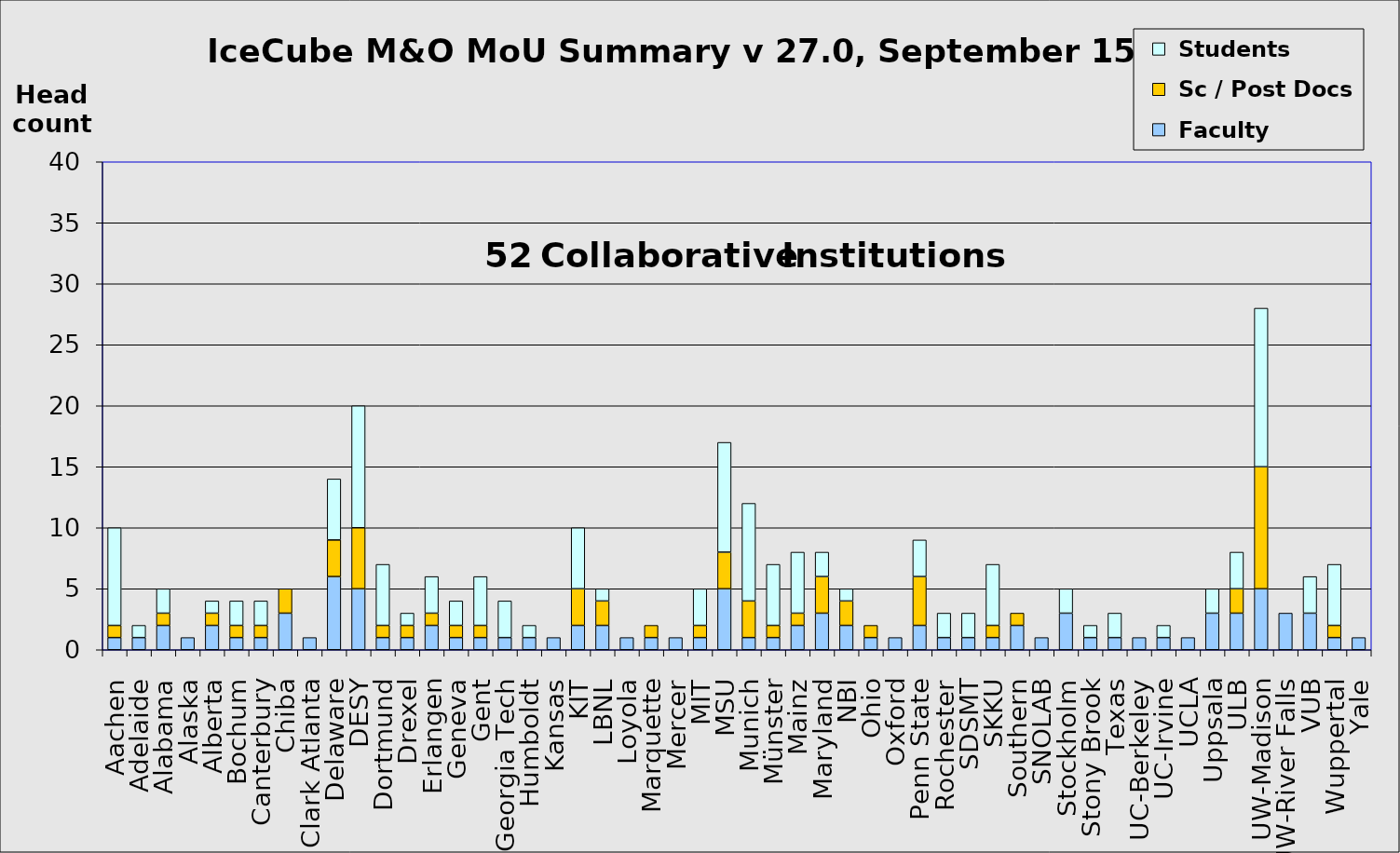
| Category |  Faculty |  Sc / Post Docs |  Students |
|---|---|---|---|
| Aachen | 1 | 1 | 8 |
| Adelaide | 1 | 0 | 1 |
| Alabama | 2 | 1 | 2 |
| Alaska | 1 | 0 | 0 |
| Alberta | 2 | 1 | 1 |
| Bochum | 1 | 1 | 2 |
| Canterbury | 1 | 1 | 2 |
| Chiba | 3 | 2 | 0 |
| Clark Atlanta | 1 | 0 | 0 |
| Delaware | 6 | 3 | 5 |
| DESY | 5 | 5 | 10 |
| Dortmund | 1 | 1 | 5 |
| Drexel | 1 | 1 | 1 |
| Erlangen | 2 | 1 | 3 |
| Geneva | 1 | 1 | 2 |
| Gent | 1 | 1 | 4 |
| Georgia Tech | 1 | 0 | 3 |
| Humboldt | 1 | 0 | 1 |
| Kansas | 1 | 0 | 0 |
| KIT | 2 | 3 | 5 |
| LBNL | 2 | 2 | 1 |
| Loyola | 1 | 0 | 0 |
| Marquette | 1 | 1 | 0 |
| Mercer | 1 | 0 | 0 |
| MIT | 1 | 1 | 3 |
| MSU | 5 | 3 | 9 |
| Munich | 1 | 3 | 8 |
| Münster | 1 | 1 | 5 |
| Mainz | 2 | 1 | 5 |
| Maryland | 3 | 3 | 2 |
| NBI | 2 | 2 | 1 |
| Ohio | 1 | 1 | 0 |
| Oxford | 1 | 0 | 0 |
| Penn State | 2 | 4 | 3 |
| Rochester | 1 | 0 | 2 |
| SDSMT | 1 | 0 | 2 |
| SKKU | 1 | 1 | 5 |
| Southern | 2 | 1 | 0 |
| SNOLAB | 1 | 0 | 0 |
| Stockholm | 3 | 0 | 2 |
| Stony Brook | 1 | 0 | 1 |
| Texas | 1 | 0 | 2 |
| UC-Berkeley | 1 | 0 | 0 |
| UC-Irvine | 1 | 0 | 1 |
| UCLA | 1 | 0 | 0 |
| Uppsala | 3 | 0 | 2 |
| ULB | 3 | 2 | 3 |
| UW-Madison | 5 | 10 | 13 |
| UW-River Falls | 3 | 0 | 0 |
| VUB | 3 | 0 | 3 |
| Wuppertal | 1 | 1 | 5 |
| Yale | 1 | 0 | 0 |